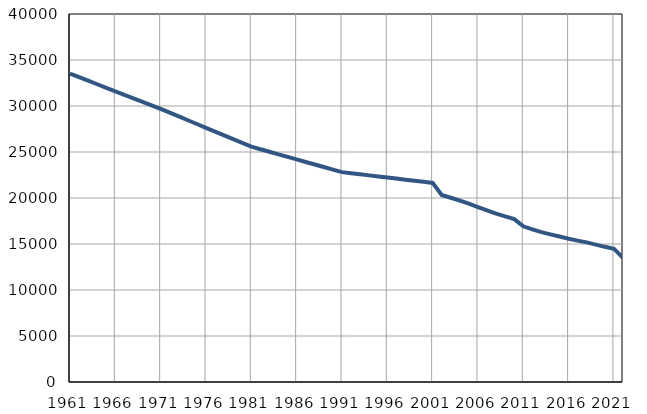
| Category | Број
становника |
|---|---|
| 1961.0 | 33514 |
| 1962.0 | 33131 |
| 1963.0 | 32748 |
| 1964.0 | 32365 |
| 1965.0 | 31982 |
| 1966.0 | 31599 |
| 1967.0 | 31216 |
| 1968.0 | 30833 |
| 1969.0 | 30450 |
| 1970.0 | 30067 |
| 1971.0 | 29684 |
| 1972.0 | 29274 |
| 1973.0 | 28863 |
| 1974.0 | 28453 |
| 1975.0 | 28042 |
| 1976.0 | 27632 |
| 1977.0 | 27221 |
| 1978.0 | 26811 |
| 1979.0 | 26400 |
| 1980.0 | 25990 |
| 1981.0 | 25579 |
| 1982.0 | 25302 |
| 1983.0 | 25025 |
| 1984.0 | 24749 |
| 1985.0 | 24472 |
| 1986.0 | 24195 |
| 1987.0 | 23918 |
| 1988.0 | 23641 |
| 1989.0 | 23365 |
| 1990.0 | 23088 |
| 1991.0 | 22811 |
| 1992.0 | 22694 |
| 1993.0 | 22577 |
| 1994.0 | 22460 |
| 1995.0 | 22343 |
| 1996.0 | 22226 |
| 1997.0 | 22109 |
| 1998.0 | 21992 |
| 1999.0 | 21875 |
| 2000.0 | 21758 |
| 2001.0 | 21641 |
| 2002.0 | 20322 |
| 2003.0 | 20026 |
| 2004.0 | 19725 |
| 2005.0 | 19383 |
| 2006.0 | 19014 |
| 2007.0 | 18661 |
| 2008.0 | 18307 |
| 2009.0 | 18005 |
| 2010.0 | 17708 |
| 2011.0 | 16921 |
| 2012.0 | 16600 |
| 2013.0 | 16295 |
| 2014.0 | 16050 |
| 2015.0 | 15814 |
| 2016.0 | 15573 |
| 2017.0 | 15369 |
| 2018.0 | 15173 |
| 2019.0 | 14926 |
| 2020.0 | 14693 |
| 2021.0 | 14487 |
| 2022.0 | 13489 |